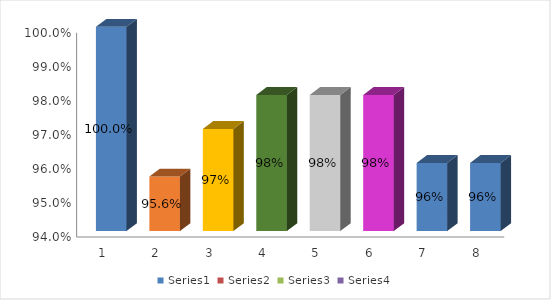
| Category | Series 0 | Series 1 | Series 2 | Series 3 |
|---|---|---|---|---|
| 0 | 1 |  |  |  |
| 1 | 0.956 |  |  |  |
| 2 | 0.97 |  |  |  |
| 3 | 0.98 |  |  |  |
| 4 | 0.98 |  |  |  |
| 5 | 0.98 |  |  |  |
| 6 | 0.96 |  |  |  |
| 7 | 0.96 |  |  |  |